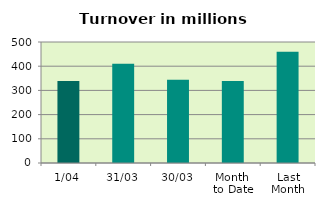
| Category | Series 0 |
|---|---|
| 1/04 | 338.788 |
| 31/03 | 410.538 |
| 30/03 | 343.518 |
| Month 
to Date | 338.788 |
| Last
Month | 459.546 |